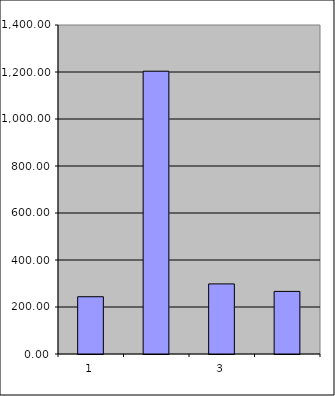
| Category | Series 0 |
|---|---|
| 0 | 243.75 |
| 1 | 1203.444 |
| 2 | 298.268 |
| 3 | 266.328 |